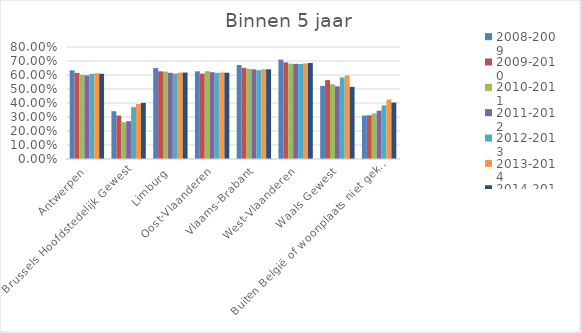
| Category | 2008-2009 | 2009-2010 | 2010-2011 | 2011-2012 | 2012-2013 | 2013-2014 | 2014-2015 |
|---|---|---|---|---|---|---|---|
| Antwerpen | 0.633 | 0.615 | 0.601 | 0.597 | 0.608 | 0.613 | 0.609 |
| Brussels Hoofdstedelijk Gewest | 0.341 | 0.311 | 0.263 | 0.27 | 0.37 | 0.392 | 0.401 |
| Limburg | 0.65 | 0.627 | 0.624 | 0.616 | 0.61 | 0.617 | 0.617 |
| Oost-Vlaanderen | 0.626 | 0.61 | 0.627 | 0.62 | 0.615 | 0.618 | 0.616 |
| Vlaams-Brabant | 0.671 | 0.651 | 0.644 | 0.64 | 0.634 | 0.641 | 0.64 |
| West-Vlaanderen | 0.71 | 0.69 | 0.681 | 0.679 | 0.678 | 0.683 | 0.686 |
| Waals Gewest | 0.522 | 0.564 | 0.533 | 0.519 | 0.583 | 0.597 | 0.515 |
| Buiten België of woonplaats niet gekend | 0.31 | 0.312 | 0.326 | 0.345 | 0.383 | 0.425 | 0.403 |